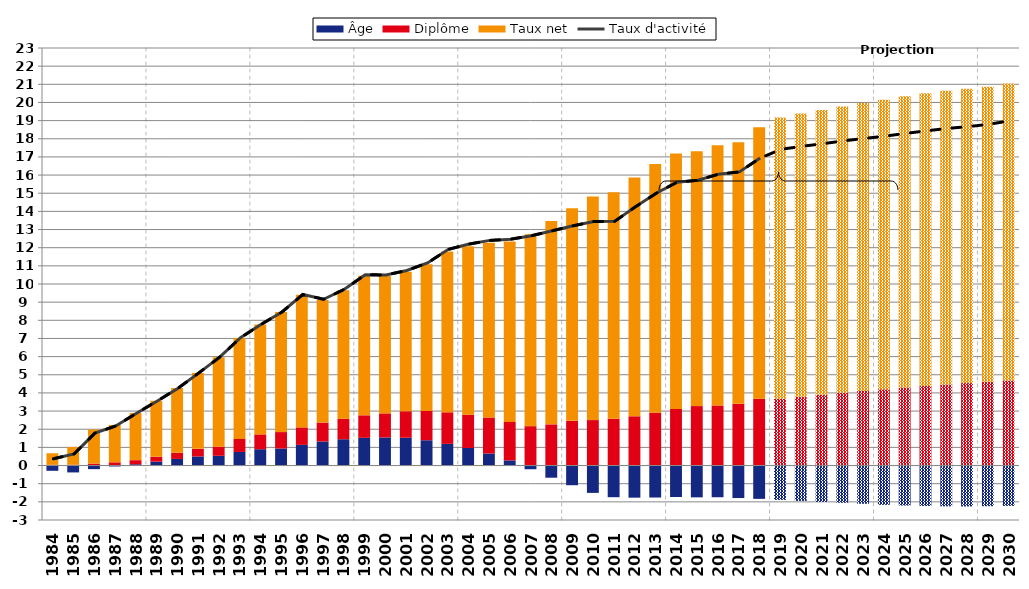
| Category | Âge | Diplôme | Taux net |
|---|---|---|---|
| 1984.0 | -0.29 | 0.04 | 0.637 |
| 1985.0 | -0.38 | 0.047 | 0.979 |
| 1986.0 | -0.199 | 0.105 | 1.879 |
| 1987.0 | -0.051 | 0.177 | 2.06 |
| 1988.0 | 0.07 | 0.226 | 2.595 |
| 1989.0 | 0.215 | 0.273 | 3.079 |
| 1990.0 | 0.365 | 0.339 | 3.561 |
| 1991.0 | 0.501 | 0.419 | 4.18 |
| 1992.0 | 0.537 | 0.504 | 4.92 |
| 1993.0 | 0.748 | 0.713 | 5.57 |
| 1994.0 | 0.899 | 0.818 | 6.057 |
| 1995.0 | 0.94 | 0.902 | 6.621 |
| 1996.0 | 1.139 | 0.963 | 7.304 |
| 1997.0 | 1.324 | 1.043 | 6.758 |
| 1998.0 | 1.448 | 1.134 | 7.078 |
| 1999.0 | 1.527 | 1.239 | 7.686 |
| 2000.0 | 1.546 | 1.327 | 7.568 |
| 2001.0 | 1.531 | 1.459 | 7.689 |
| 2002.0 | 1.393 | 1.611 | 8.079 |
| 2003.0 | 1.194 | 1.739 | 8.86 |
| 2004.0 | 0.969 | 1.834 | 9.275 |
| 2005.0 | 0.663 | 1.983 | 9.627 |
| 2006.0 | 0.284 | 2.116 | 9.94 |
| 2007.0 | -0.204 | 2.171 | 10.564 |
| 2008.0 | -0.671 | 2.268 | 11.207 |
| 2009.0 | -1.084 | 2.462 | 11.704 |
| 2010.0 | -1.507 | 2.503 | 12.313 |
| 2011.0 | -1.744 | 2.577 | 12.476 |
| 2012.0 | -1.77 | 2.714 | 13.154 |
| 2013.0 | -1.761 | 2.91 | 13.694 |
| 2014.0 | -1.735 | 3.12 | 14.064 |
| 2015.0 | -1.753 | 3.274 | 14.039 |
| 2016.0 | -1.747 | 3.308 | 14.338 |
| 2017.0 | -1.79 | 3.405 | 14.404 |
| 2018.0 | -1.836 | 3.673 | 14.955 |
| 2019.0 | -1.894 | 3.68 | 15.486 |
| 2020.0 | -1.95 | 3.793 | 15.593 |
| 2021.0 | -2.003 | 3.902 | 15.676 |
| 2022.0 | -2.05 | 4.008 | 15.772 |
| 2023.0 | -2.105 | 4.109 | 15.857 |
| 2024.0 | -2.165 | 4.205 | 15.947 |
| 2025.0 | -2.202 | 4.297 | 16.039 |
| 2026.0 | -2.227 | 4.384 | 16.119 |
| 2027.0 | -2.248 | 4.465 | 16.187 |
| 2028.0 | -2.254 | 4.541 | 16.217 |
| 2029.0 | -2.241 | 4.612 | 16.259 |
| 2030.0 | -2.223 | 4.679 | 16.368 |